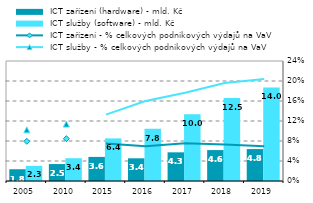
| Category |  ICT zařízení (hardware) - mld. Kč |  ICT služby (software) - mld. Kč |
|---|---|---|
| 2005.0 | 1.762 | 2.271 |
| 2010.0 | 2.54 | 3.415 |
| 2015.0 | 3.612 | 6.388 |
| 2016.0 | 3.403 | 7.83 |
| 2017.0 | 4.301 | 10.029 |
| 2018.0 | 4.637 | 12.464 |
| 2019.0 | 4.789 | 14.041 |